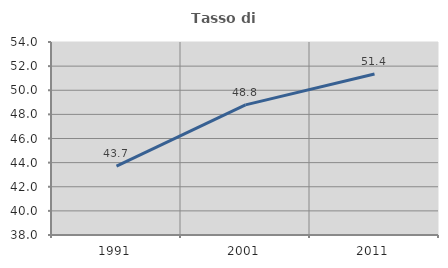
| Category | Tasso di occupazione   |
|---|---|
| 1991.0 | 43.715 |
| 2001.0 | 48.789 |
| 2011.0 | 51.354 |